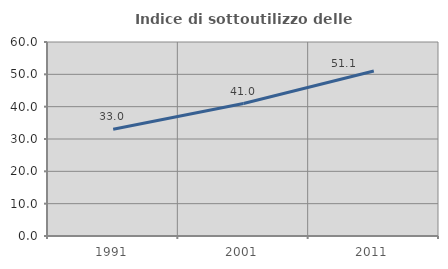
| Category | Indice di sottoutilizzo delle abitazioni  |
|---|---|
| 1991.0 | 32.989 |
| 2001.0 | 40.956 |
| 2011.0 | 51.054 |